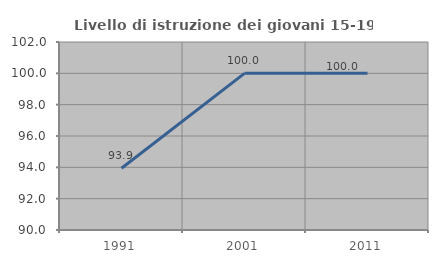
| Category | Livello di istruzione dei giovani 15-19 anni |
|---|---|
| 1991.0 | 93.939 |
| 2001.0 | 100 |
| 2011.0 | 100 |